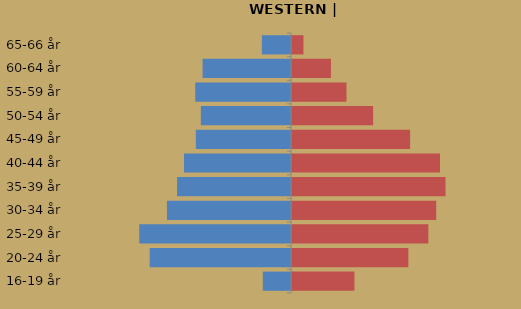
| Category | % Indvandrere fra vestlige lande | %Indvandrere fra ikke-vestlige lande |
|---|---|---|
| 16-19 år | -0.026 | 0.059 |
| 20-24 år | -0.133 | 0.109 |
| 25-29 år | -0.143 | 0.128 |
| 30-34 år | -0.116 | 0.135 |
| 35-39 år | -0.107 | 0.144 |
| 40-44 år | -0.1 | 0.139 |
| 45-49 år | -0.089 | 0.111 |
| 50-54 år | -0.085 | 0.076 |
| 55-59 år | -0.09 | 0.051 |
| 60-64 år | -0.083 | 0.037 |
| 65-66 år | -0.027 | 0.011 |